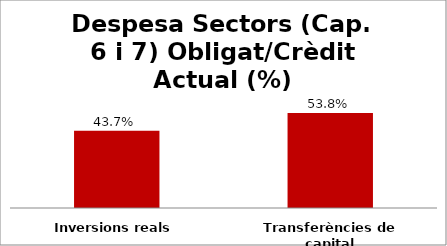
| Category | Series 0 |
|---|---|
| Inversions reals | 0.437 |
| Transferències de capital | 0.538 |